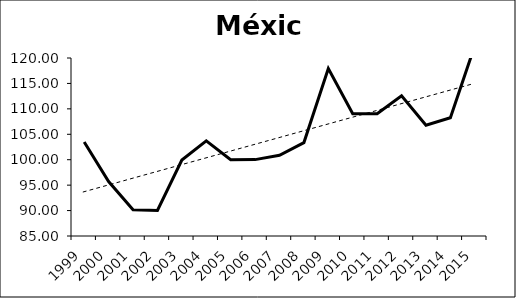
| Category | Series 0 |
|---|---|
| 1999.0 | 103.48 |
| 2000.0 | 95.7 |
| 2001.0 | 90.17 |
| 2002.0 | 90.03 |
| 2003.0 | 99.94 |
| 2004.0 | 103.72 |
| 2005.0 | 100 |
| 2006.0 | 100.02 |
| 2007.0 | 100.88 |
| 2008.0 | 103.37 |
| 2009.0 | 117.94 |
| 2010.0 | 109.06 |
| 2011.0 | 109.06 |
| 2012.0 | 112.59 |
| 2013.0 | 106.78 |
| 2014.0 | 108.25 |
| 2015.0 | 122.43 |